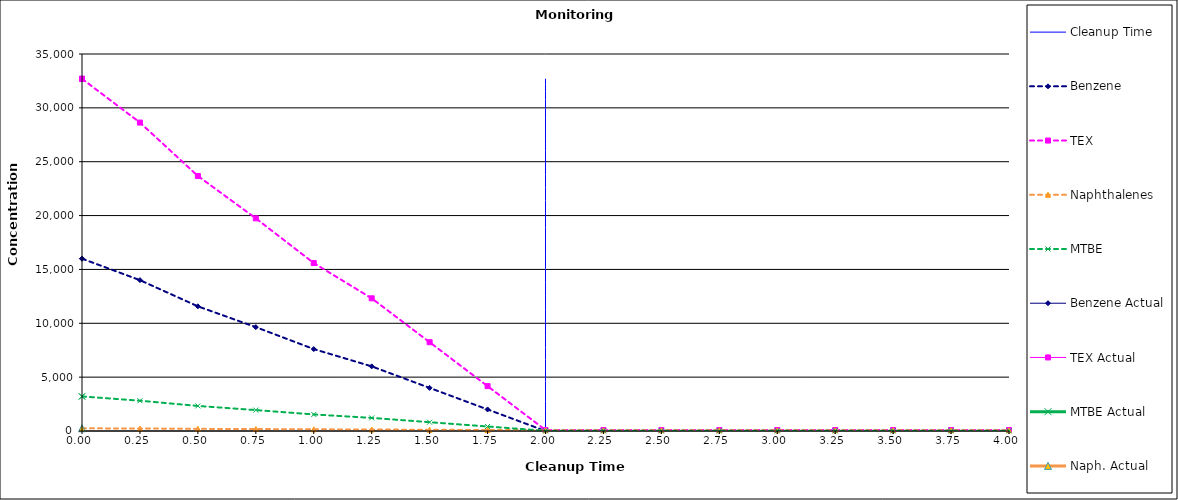
| Category | Cleanup Time |
|---|---|
| 2.0 | 0 |
| 2.0 | 32700 |